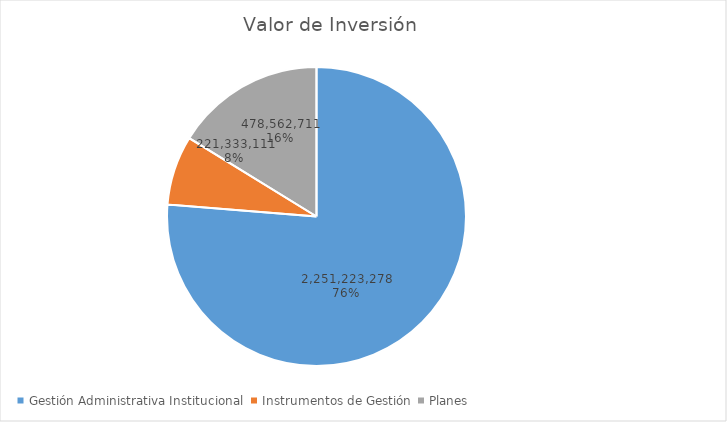
| Category | Valor de Inversión | Porcentaje de Ejecución dentro de la Actividad |
|---|---|---|
| Gestión Administrativa Institucional | 2251223278 | 6 |
| Instrumentos de Gestión | 221333111 | 1 |
| Planes | 478562711 | 4 |